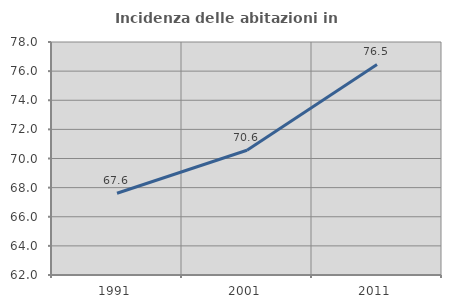
| Category | Incidenza delle abitazioni in proprietà  |
|---|---|
| 1991.0 | 67.614 |
| 2001.0 | 70.567 |
| 2011.0 | 76.456 |